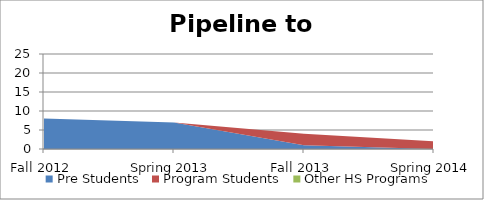
| Category | Pre Students | Program Students | Other HS Programs |
|---|---|---|---|
| Fall 2012 | 8 | 0 | 0 |
| Spring 2013 | 7 | 0 | 0 |
| Fall 2013 | 1 | 3 | 0 |
| Spring 2014 | 0 | 2 | 0 |